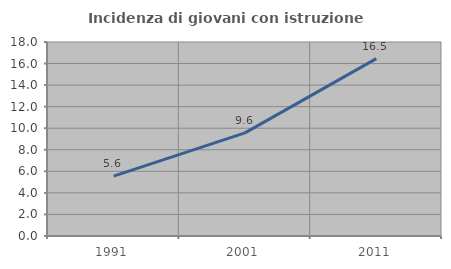
| Category | Incidenza di giovani con istruzione universitaria |
|---|---|
| 1991.0 | 5.556 |
| 2001.0 | 9.565 |
| 2011.0 | 16.456 |